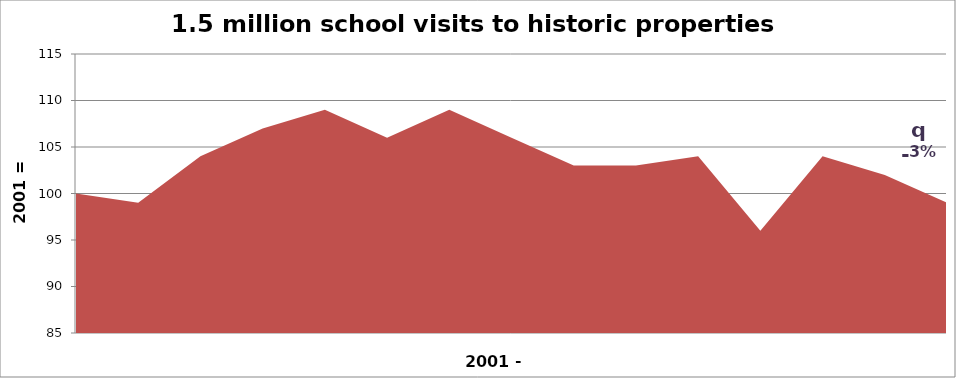
| Category | (2001=100)  |
|---|---|
| 0 | 100 |
| 1 | 99 |
| 2 | 104 |
| 3 | 107 |
| 4 | 109 |
| 5 | 106 |
| 6 | 109 |
| 7 | 106 |
| 8 | 103 |
| 9 | 103 |
| 10 | 104 |
| 11 | 96 |
| 12 | 104 |
| 13 | 102 |
| 14 | 99 |